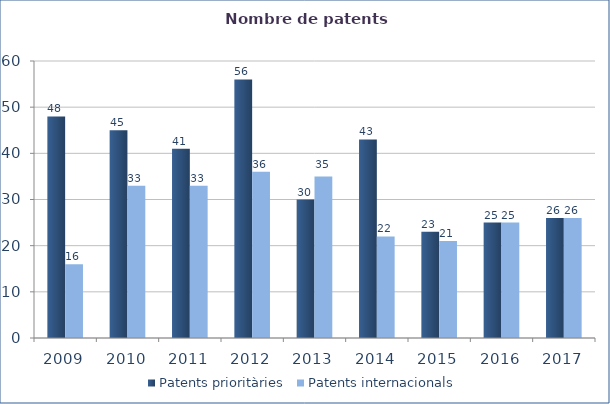
| Category | Patents prioritàries | Patents internacionals |
|---|---|---|
| 2009.0 | 48 | 16 |
| 2010.0 | 45 | 33 |
| 2011.0 | 41 | 33 |
| 2012.0 | 56 | 36 |
| 2013.0 | 30 | 35 |
| 2014.0 | 43 | 22 |
| 2015.0 | 23 | 21 |
| 2016.0 | 25 | 25 |
| 2017.0 | 26 | 26 |